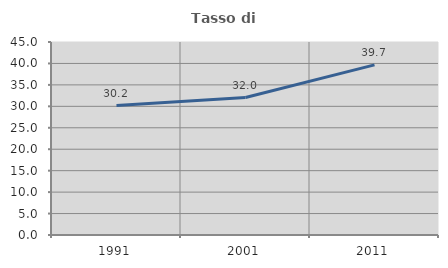
| Category | Tasso di occupazione   |
|---|---|
| 1991.0 | 30.166 |
| 2001.0 | 32.045 |
| 2011.0 | 39.659 |